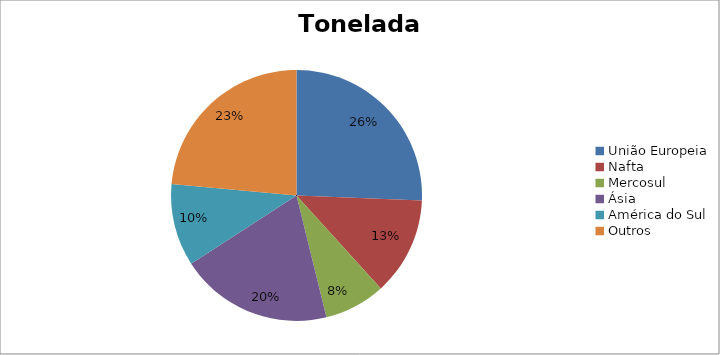
| Category | Series 0 |
|---|---|
| União Europeia | 4237486.62 |
| Nafta | 2089210.098 |
| Mercosul | 1303526.627 |
| Ásia | 3253864.997 |
| América do Sul | 1752260.259 |
| Outros | 3891940.879 |